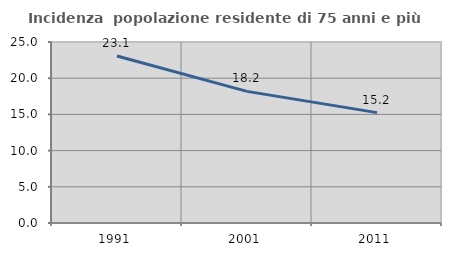
| Category | Incidenza  popolazione residente di 75 anni e più |
|---|---|
| 1991.0 | 23.058 |
| 2001.0 | 18.182 |
| 2011.0 | 15.247 |